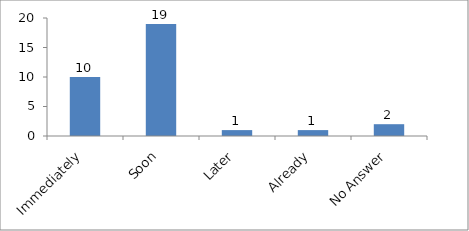
| Category | When would you like to begin your changemaking journey?  |
|---|---|
| Immediately | 10 |
| Soon | 19 |
| Later | 1 |
| Already | 1 |
| No Answer | 2 |